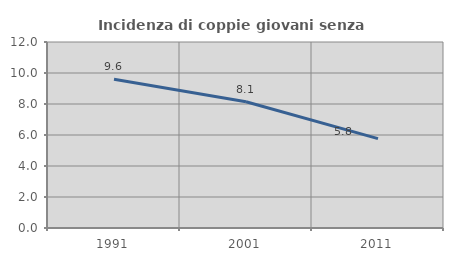
| Category | Incidenza di coppie giovani senza figli |
|---|---|
| 1991.0 | 9.591 |
| 2001.0 | 8.144 |
| 2011.0 | 5.767 |